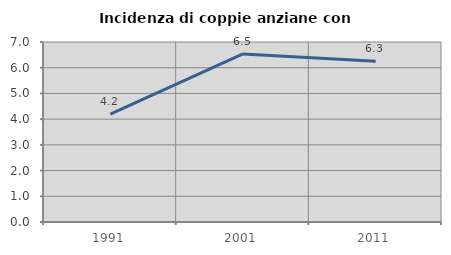
| Category | Incidenza di coppie anziane con figli |
|---|---|
| 1991.0 | 4.196 |
| 2001.0 | 6.536 |
| 2011.0 | 6.25 |